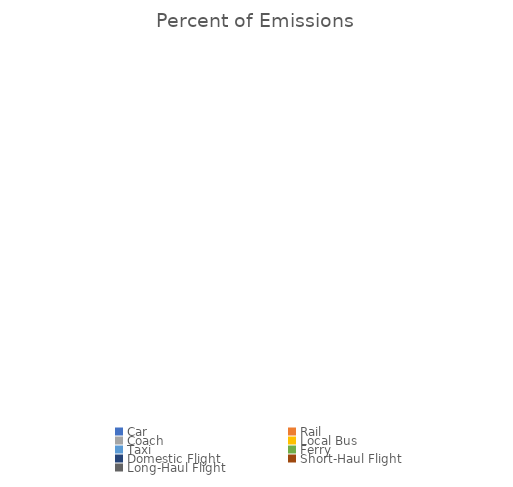
| Category | Percent of Emissions |
|---|---|
| Car | 0 |
| Rail | 0 |
| Coach | 0 |
| Local Bus | 0 |
| Taxi | 0 |
| Ferry | 0 |
| Domestic Flight | 0 |
| Short-Haul Flight | 0 |
| Long-Haul Flight | 0 |